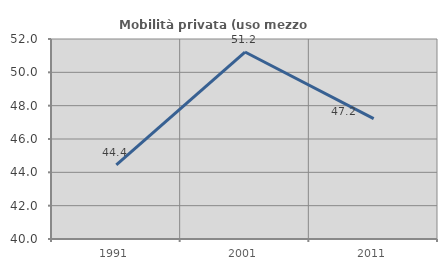
| Category | Mobilità privata (uso mezzo privato) |
|---|---|
| 1991.0 | 44.444 |
| 2001.0 | 51.22 |
| 2011.0 | 47.222 |